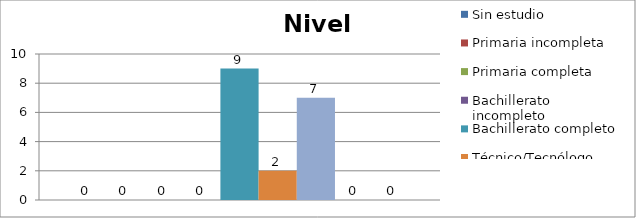
| Category | Sin estudio | Primaria incompleta | Primaria completa | Bachillerato incompleto | Bachillerato completo | Técnico/Tecnólogo | Universitario | Post-grado | Especialización |
|---|---|---|---|---|---|---|---|---|---|
| 0 | 0 | 0 | 0 | 0 | 9 | 2 | 7 | 0 | 0 |